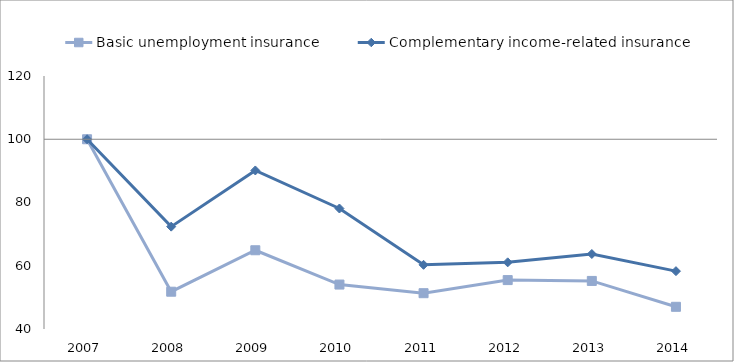
| Category | Basic unemployment insurance | Complementary income-related insurance | 0 |
|---|---|---|---|
| 2007.0 | 100 | 100 |  |
| 2008.0 | 51.793 | 72.366 |  |
| 2009.0 | 64.899 | 90.133 |  |
| 2010.0 | 54.053 | 78.103 |  |
| 2011.0 | 51.319 | 60.294 |  |
| 2012.0 | 55.469 | 61.08 |  |
| 2013.0 | 55.2 | 63.715 |  |
| 2014.0 | 47.019 | 58.294 |  |